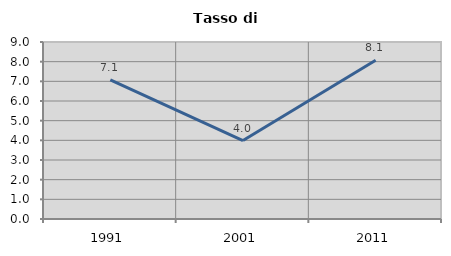
| Category | Tasso di disoccupazione   |
|---|---|
| 1991.0 | 7.076 |
| 2001.0 | 3.987 |
| 2011.0 | 8.068 |